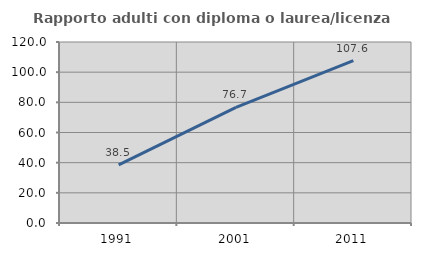
| Category | Rapporto adulti con diploma o laurea/licenza media  |
|---|---|
| 1991.0 | 38.532 |
| 2001.0 | 76.692 |
| 2011.0 | 107.586 |